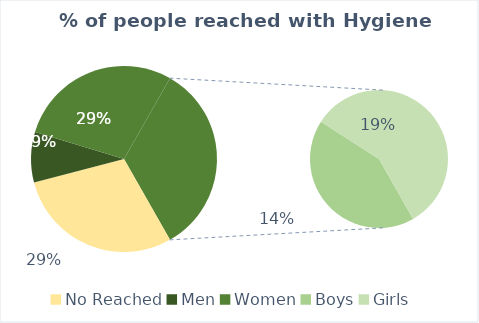
| Category | Series 0 |
|---|---|
| No Reached | 34755 |
| Men | 10425 |
| Women | 34015 |
| Boys | 16917 |
| Girls | 23043 |